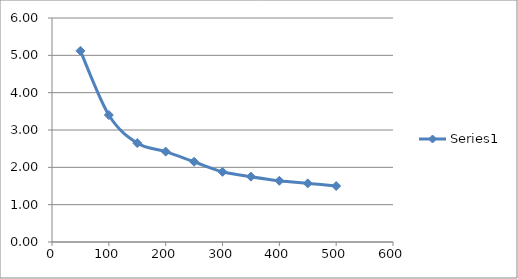
| Category | Series 0 |
|---|---|
| 50.0 | 5.12 |
| 100.0 | 3.4 |
| 150.0 | 2.65 |
| 200.0 | 2.42 |
| 250.0 | 2.15 |
| 300.0 | 1.88 |
| 350.0 | 1.75 |
| 400.0 | 1.64 |
| 450.0 | 1.57 |
| 500.0 | 1.5 |